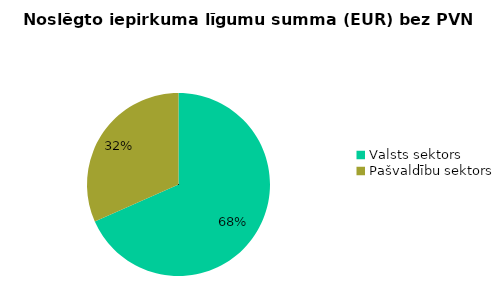
| Category | Noslēgto iepirkuma līgumu summa (EUR) bez PVN |
|---|---|
| Valsts sektors | 66974471 |
| Pašvaldību sektors | 30953055 |